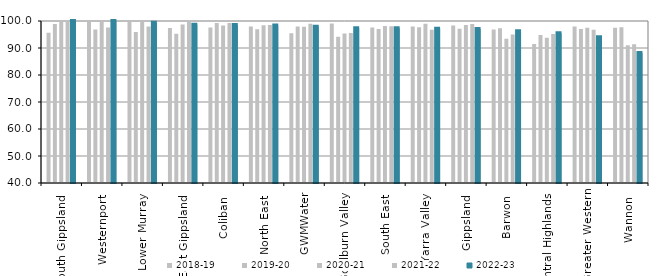
| Category | 2018-19 | 2019-20 | 2020-21 | 2021-22 | 2022-23 |
|---|---|---|---|---|---|
| South Gippsland  | 95.614 | 98.889 | 100 | 100 | 100 |
| Westernport  | 100 | 96.825 | 100 | 97.561 | 100 |
| Lower Murray  | 100 | 95.918 | 100 | 97.973 | 99.324 |
| East Gippsland  | 97.403 | 95.238 | 98.667 | 100 | 98.611 |
| Coliban  | 97.552 | 99.237 | 98.312 | 99.286 | 98.556 |
| North East  | 97.949 | 96.916 | 98.396 | 98.485 | 98.333 |
| GWMWater | 95.431 | 97.947 | 97.847 | 99.02 | 97.886 |
| Goulburn Valley  | 99.057 | 94.18 | 95.339 | 95.6 | 97.34 |
| South East  | 97.547 | 97.039 | 98.162 | 98.018 | 97.338 |
| Yarra Valley  | 97.918 | 97.69 | 98.953 | 96.778 | 97.083 |
| Gippsland  | 98.297 | 97.161 | 98.504 | 98.88 | 97.024 |
| Barwon  | 96.887 | 97.321 | 93.429 | 95.008 | 96.207 |
| Central Highlands  | 91.513 | 94.792 | 93.822 | 95.223 | 95.498 |
| Greater Western | 97.932 | 97.072 | 97.496 | 96.739 | 94.018 |
| Wannon  | 97.479 | 97.647 | 90.991 | 91.411 | 88.112 |